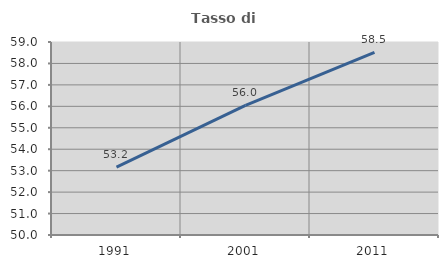
| Category | Tasso di occupazione   |
|---|---|
| 1991.0 | 53.169 |
| 2001.0 | 56.048 |
| 2011.0 | 58.518 |